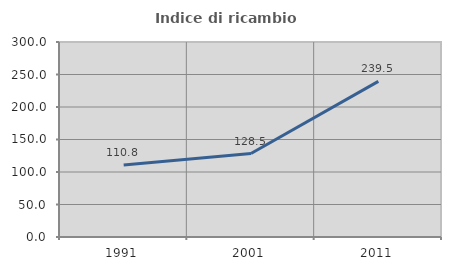
| Category | Indice di ricambio occupazionale  |
|---|---|
| 1991.0 | 110.777 |
| 2001.0 | 128.453 |
| 2011.0 | 239.498 |